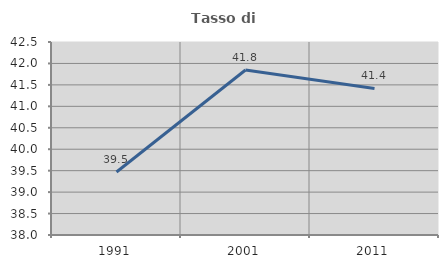
| Category | Tasso di occupazione   |
|---|---|
| 1991.0 | 39.469 |
| 2001.0 | 41.847 |
| 2011.0 | 41.418 |